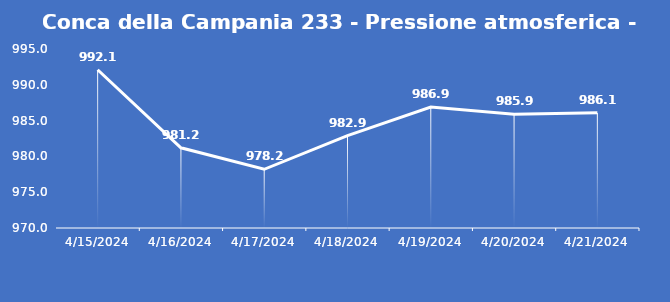
| Category | Conca della Campania 233 - Pressione atmosferica - Grezzo (hPa) |
|---|---|
| 4/15/24 | 992.1 |
| 4/16/24 | 981.2 |
| 4/17/24 | 978.2 |
| 4/18/24 | 982.9 |
| 4/19/24 | 986.9 |
| 4/20/24 | 985.9 |
| 4/21/24 | 986.1 |